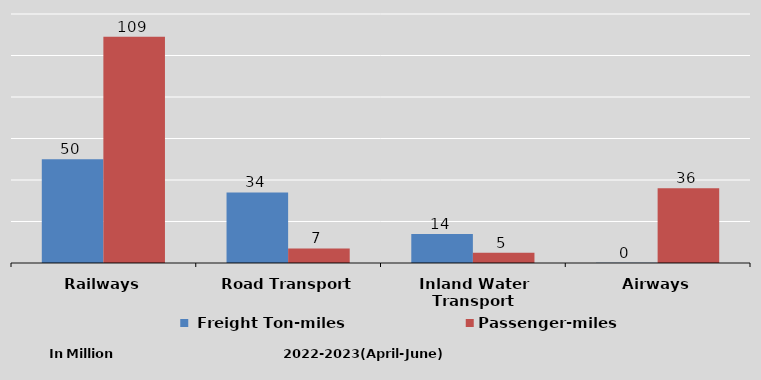
| Category |  Freight Ton-miles | Passenger-miles |
|---|---|---|
| Railways | 50 | 109 |
| Road Transport | 34 | 7 |
| Inland Water Transport | 14 | 5 |
| Airways | 0.13 | 36 |